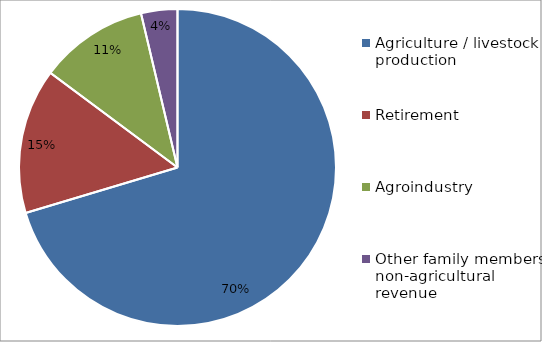
| Category | Series 0 |
|---|---|
| Agriculture / livestock production | 19 |
| Retirement | 4 |
| Agroindustry | 3 |
| Other family members' non-agricultural revenue | 1 |